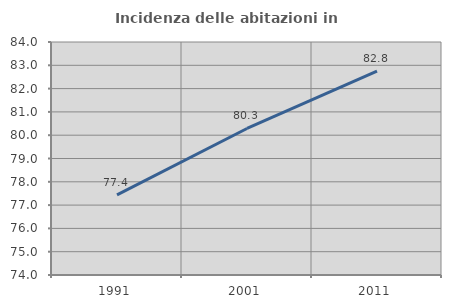
| Category | Incidenza delle abitazioni in proprietà  |
|---|---|
| 1991.0 | 77.438 |
| 2001.0 | 80.288 |
| 2011.0 | 82.755 |